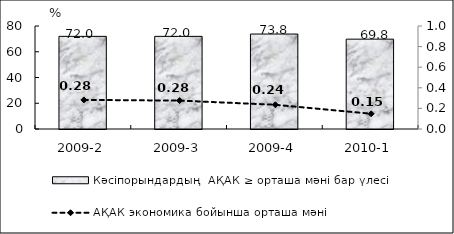
| Category | Кәсіпорындардың  АҚАК ≥ орташа мәні бар үлесі  |
|---|---|
| 2009-2 | 71.95 |
| 2009-3 | 71.95 |
| 2009-4 | 73.76 |
| 2010-1 | 69.79 |